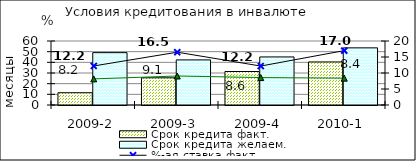
| Category | Срок кредита факт.  | Срок кредита желаем. |
|---|---|---|
| 2009-2 | 11.5 | 49.1 |
| 2009-3 | 25.5 | 42.28 |
| 2009-4 | 31.4 | 45.06 |
| 2010-1 | 40.33 | 53.58 |